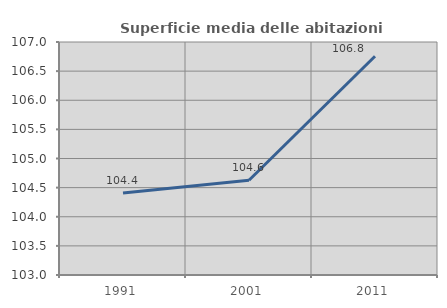
| Category | Superficie media delle abitazioni occupate |
|---|---|
| 1991.0 | 104.41 |
| 2001.0 | 104.626 |
| 2011.0 | 106.755 |